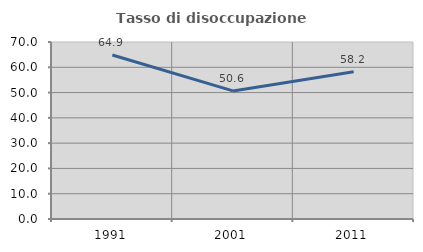
| Category | Tasso di disoccupazione giovanile  |
|---|---|
| 1991.0 | 64.881 |
| 2001.0 | 50.649 |
| 2011.0 | 58.228 |